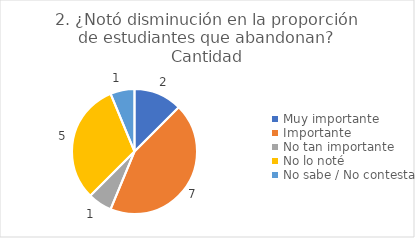
| Category | 2. ¿Notó disminución en la proporción de estudiantes que abandonan? |
|---|---|
| Muy importante  | 0.125 |
| Importante  | 0.438 |
| No tan importante  | 0.062 |
| No lo noté  | 0.312 |
| No sabe / No contesta | 0.062 |